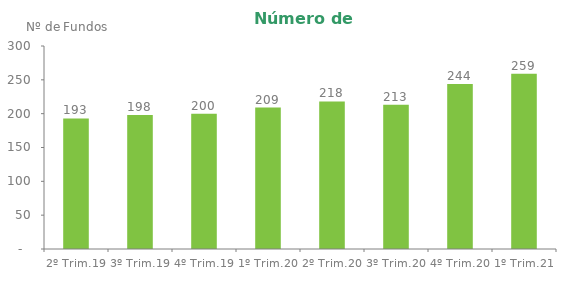
| Category | Series 0 |
|---|---|
| 2º Trim.19 | 193 |
| 3º Trim.19 | 198 |
| 4º Trim.19 | 200 |
| 1º Trim.20 | 209 |
| 2º Trim.20 | 218 |
| 3º Trim.20 | 213 |
| 4º Trim.20 | 244 |
| 1º Trim.21 | 259 |